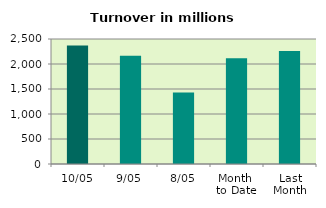
| Category | Series 0 |
|---|---|
| 10/05 | 2368.824 |
| 9/05 | 2164.25 |
| 8/05 | 1431.234 |
| Month 
to Date | 2113.715 |
| Last
Month | 2261.282 |